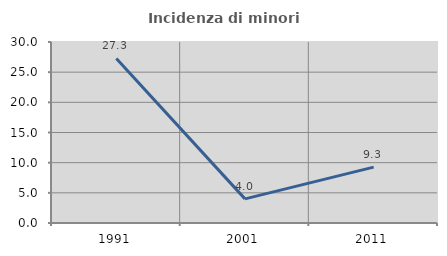
| Category | Incidenza di minori stranieri |
|---|---|
| 1991.0 | 27.273 |
| 2001.0 | 4 |
| 2011.0 | 9.259 |